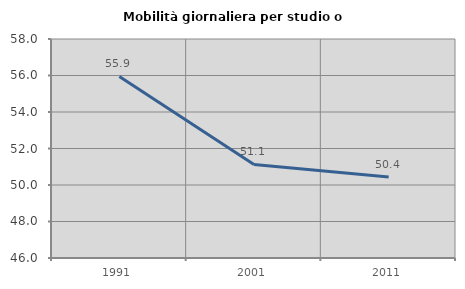
| Category | Mobilità giornaliera per studio o lavoro |
|---|---|
| 1991.0 | 55.949 |
| 2001.0 | 51.13 |
| 2011.0 | 50.432 |